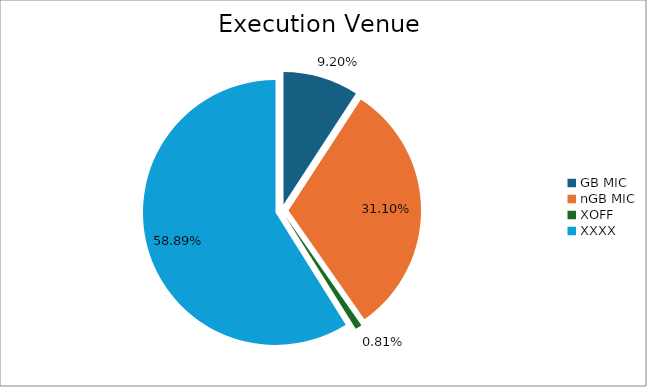
| Category | Series 0 |
|---|---|
| GB MIC | 1012530.084 |
| nGB MIC | 3423329.854 |
| XOFF | 89405.317 |
| XXXX | 6482883.095 |